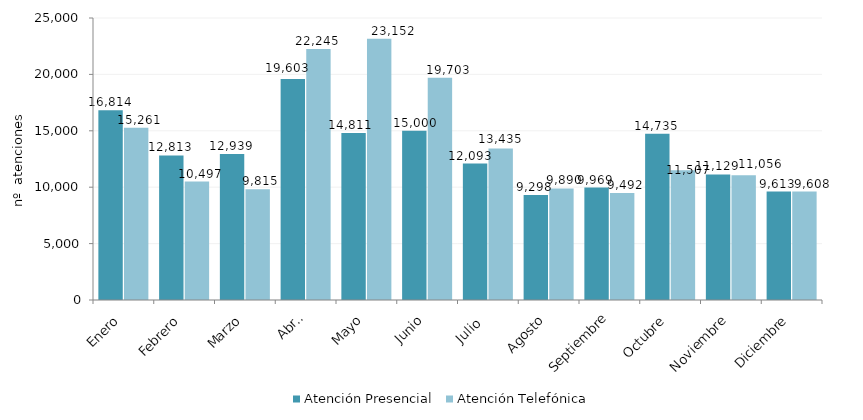
| Category | Atención Presencial | Atención Telefónica |
|---|---|---|
| Enero | 16814 | 15261 |
| Febrero | 12813 | 10497 |
| Marzo | 12939 | 9815 |
| Abril | 19603 | 22245 |
| Mayo | 14811 | 23152 |
| Junio | 15000 | 19703 |
| Julio  | 12093 | 13435 |
| Agosto | 9298 | 9890 |
| Septiembre | 9969 | 9492 |
| Octubre | 14735 | 11507 |
| Noviembre | 11129 | 11056 |
| Diciembre | 9613 | 9608 |